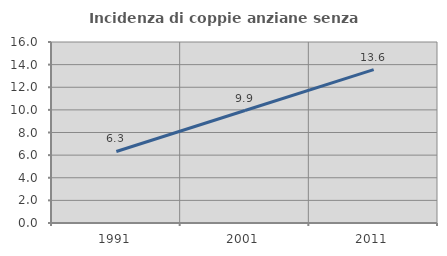
| Category | Incidenza di coppie anziane senza figli  |
|---|---|
| 1991.0 | 6.324 |
| 2001.0 | 9.944 |
| 2011.0 | 13.555 |